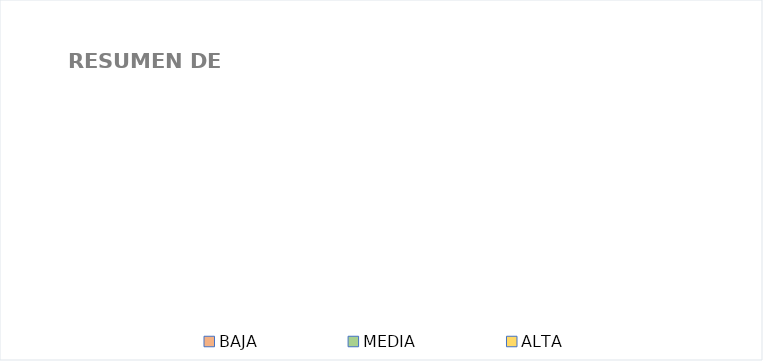
| Category | Series 0 |
|---|---|
| BAJA | 0 |
| MEDIA | 0 |
| ALTA | 0 |